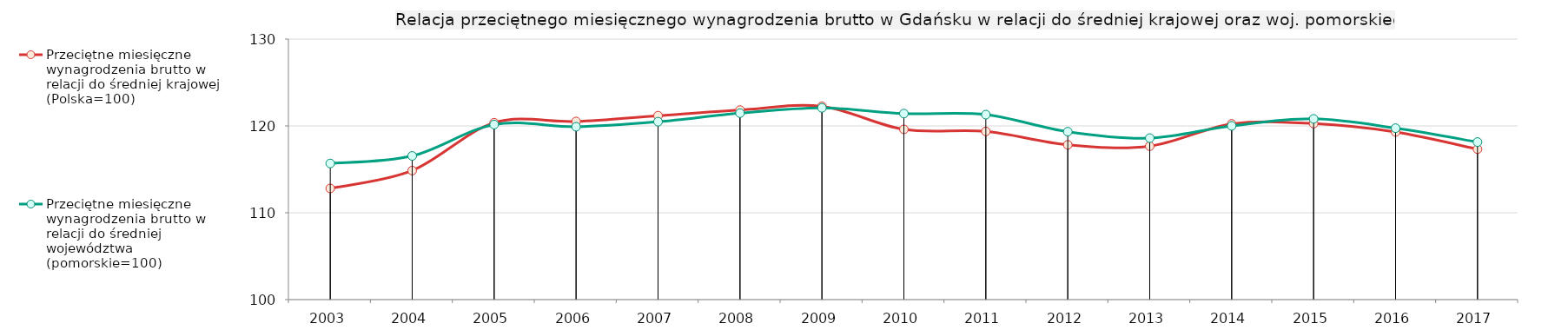
| Category | Przeciętne miesięczne wynagrodzenia brutto w relacji do średniej krajowej (Polska=100) | Przeciętne miesięczne wynagrodzenia brutto w relacji do średniej województwa (pomorskie=100) |
|---|---|---|
| 2003.0 | 112.803 | 115.676 |
| 2004.0 | 114.856 | 116.548 |
| 2005.0 | 120.364 | 120.157 |
| 2006.0 | 120.513 | 119.904 |
| 2007.0 | 121.18 | 120.486 |
| 2008.0 | 121.828 | 121.473 |
| 2009.0 | 122.254 | 122.081 |
| 2010.0 | 119.603 | 121.421 |
| 2011.0 | 119.368 | 121.3 |
| 2012.0 | 117.822 | 119.336 |
| 2013.0 | 117.672 | 118.599 |
| 2014.0 | 120.234 | 120.006 |
| 2015.0 | 120.267 | 120.813 |
| 2016.0 | 119.3 | 119.741 |
| 2017.0 | 117.328 | 118.143 |